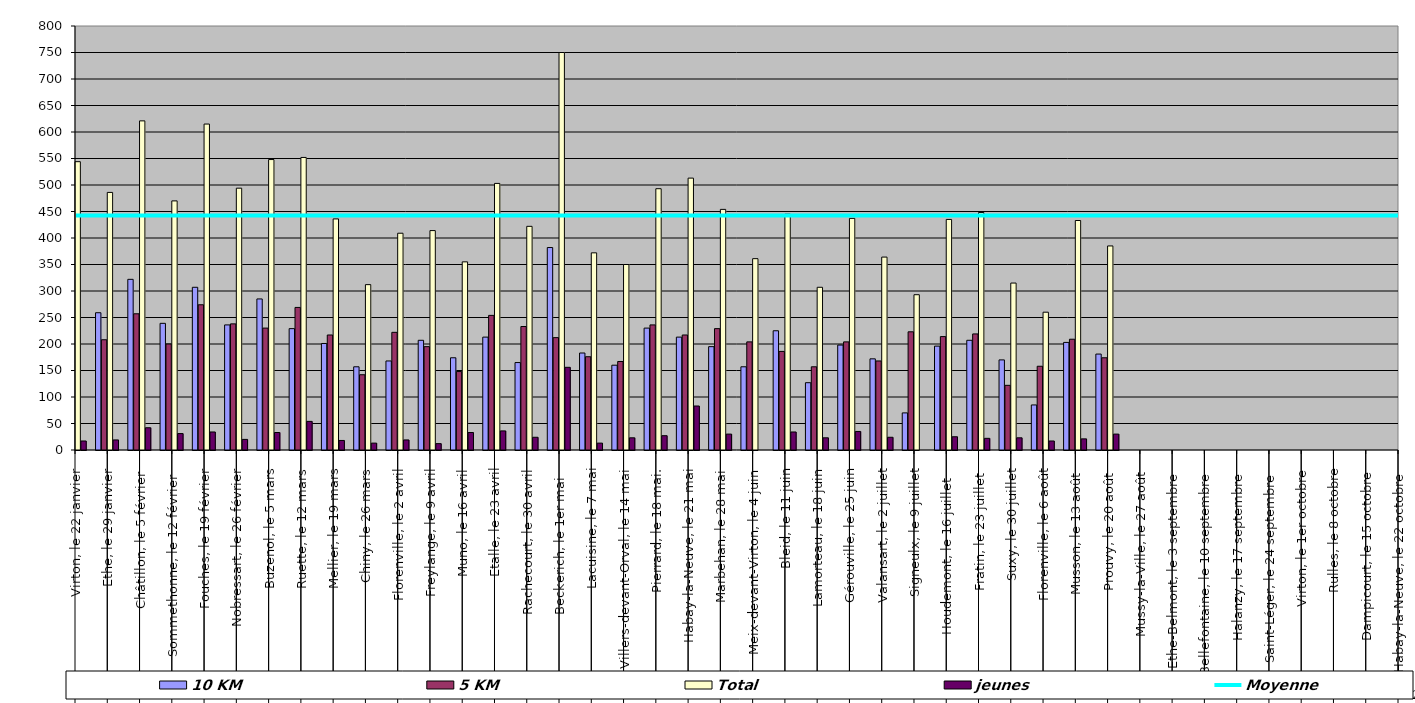
| Category | 10 KM | 5 KM | Total | jeunes |
|---|---|---|---|---|
| 0 | 296 | 231 | 544 | 17 |
| 1 | 259 | 208 | 486 | 19 |
| 2 | 322 | 257 | 621 | 42 |
| 3 | 239 | 200 | 470 | 31 |
| 4 | 307 | 274 | 615 | 34 |
| 5 | 236 | 238 | 494 | 20 |
| 6 | 285 | 230 | 548 | 33 |
| 7 | 229 | 269 | 552 | 54 |
| 8 | 201 | 217 | 436 | 18 |
| 9 | 157 | 142 | 312 | 13 |
| 10 | 168 | 222 | 409 | 19 |
| 11 | 207 | 195 | 414 | 12 |
| 12 | 174 | 148 | 355 | 33 |
| 13 | 213 | 254 | 503 | 36 |
| 14 | 165 | 233 | 422 | 24 |
| 15 | 382 | 212 | 750 | 156 |
| 16 | 183 | 176 | 372 | 13 |
| 17 | 160 | 167 | 350 | 23 |
| 18 | 230 | 236 | 493 | 27 |
| 19 | 213 | 217 | 513 | 83 |
| 20 | 195 | 229 | 454 | 30 |
| 21 | 157 | 204 | 361 | 0 |
| 22 | 225 | 186 | 445 | 34 |
| 23 | 127 | 157 | 307 | 23 |
| 24 | 198 | 204 | 437 | 35 |
| 25 | 172 | 168 | 364 | 24 |
| 26 | 70 | 223 | 293 | 0 |
| 27 | 196 | 214 | 435 | 25 |
| 28 | 207 | 219 | 448 | 22 |
| 29 | 170 | 122 | 315 | 23 |
| 30 | 85 | 158 | 260 | 17 |
| 31 | 203 | 209 | 433 | 21 |
| 32 | 181 | 174 | 385 | 30 |
| 33 | 0 | 0 | 0 | 0 |
| 34 | 0 | 0 | 0 | 0 |
| 35 | 0 | 0 | 0 | 0 |
| 36 | 0 | 0 | 0 | 0 |
| 37 | 0 | 0 | 0 | 0 |
| 38 | 0 | 0 | 0 | 0 |
| 39 | 0 | 0 | 0 | 0 |
| 40 | 0 | 0 | 0 | 0 |
| 41 | 0 | 0 | 0 | 0 |